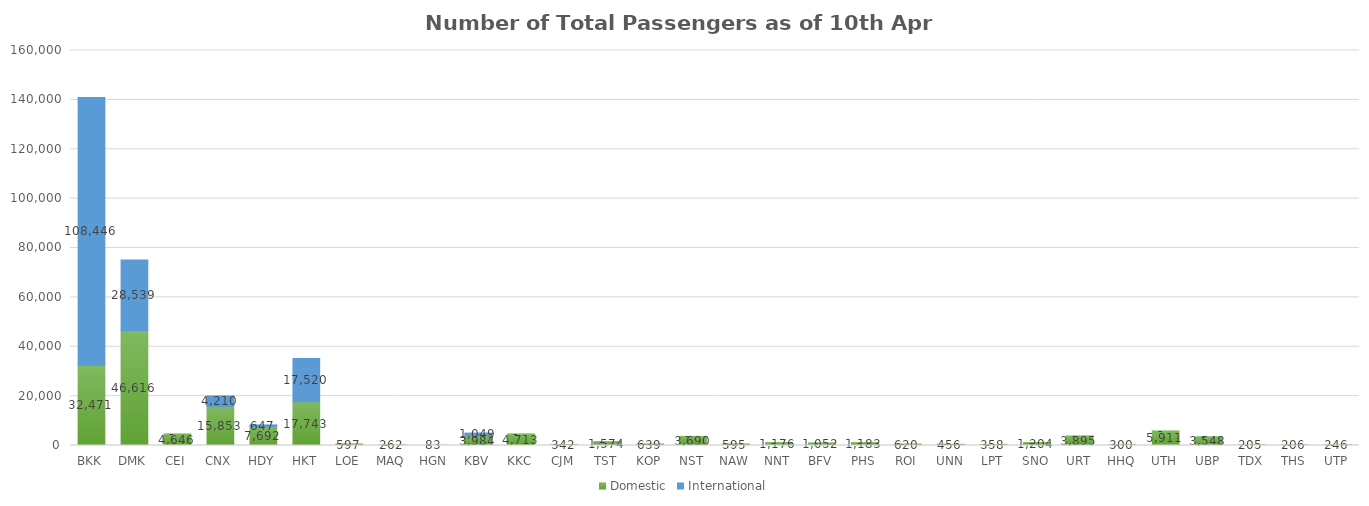
| Category | Domestic | International |
|---|---|---|
| BKK | 32471 | 108446 |
| DMK | 46616 | 28539 |
| CEI | 4646 | 0 |
| CNX | 15853 | 4210 |
| HDY | 7692 | 647 |
| HKT | 17743 | 17520 |
| LOE | 597 | 0 |
| MAQ | 262 | 0 |
| HGN | 83 | 0 |
| KBV | 3984 | 1049 |
| KKC | 4713 | 0 |
| CJM | 342 | 0 |
| TST | 1574 | 0 |
| KOP | 639 | 0 |
| NST | 3690 | 0 |
| NAW | 595 | 0 |
| NNT | 1176 | 0 |
| BFV | 1052 | 0 |
| PHS | 1183 | 0 |
| ROI | 620 | 0 |
| UNN | 456 | 0 |
| LPT | 358 | 0 |
| SNO | 1204 | 0 |
| URT | 3895 | 0 |
| HHQ | 300 | 0 |
| UTH | 5911 | 0 |
| UBP | 3548 | 0 |
| TDX | 205 | 0 |
| THS | 206 | 0 |
| UTP | 246 | 0 |